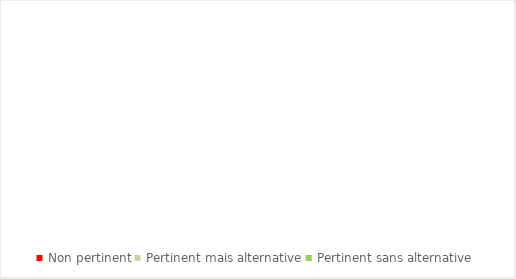
| Category | Series 0 |
|---|---|
| Non pertinent | 0 |
| Pertinent mais alternative | 0 |
| Pertinent sans alternative | 0 |